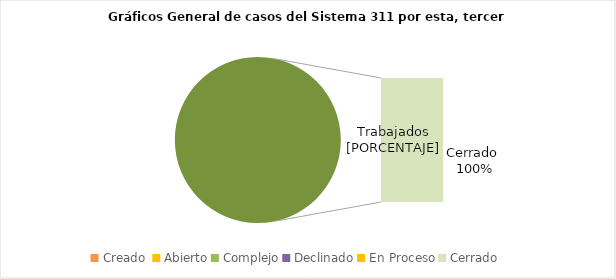
| Category | Series 0 |
|---|---|
| Creado  | 0 |
| Abierto | 0 |
| Complejo | 0 |
| Declinado | 0 |
| En Proceso | 0 |
| Cerrado  | 1 |